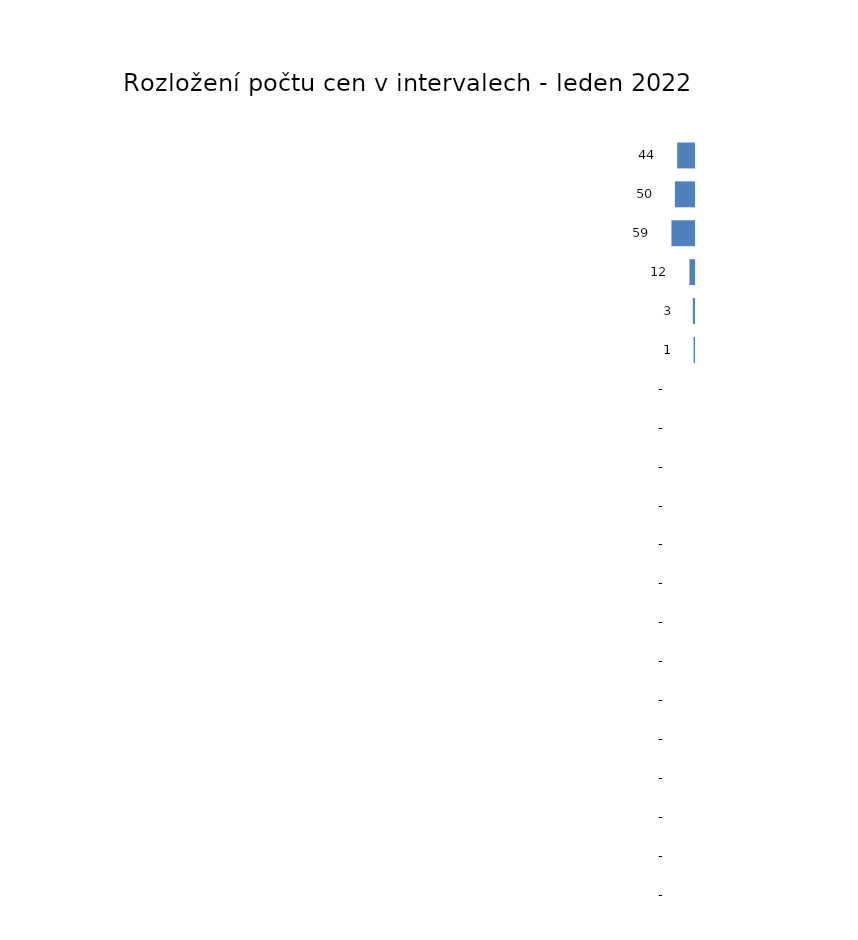
| Category | Rozložení počtu cen v intervalech - leden |
|---|---|
| ( 0 - 250 > | 44 |
| ( 250 - 500 > | 50 |
| ( 500 - 750 > | 59 |
| ( 750 - 1000 > | 12 |
| ( 1000 - 1250 > | 3 |
| ( 1250 - 1500 > | 1 |
| ( 1500 - 1750 > | 0 |
| ( 1750 - 2000 > | 0 |
| ( 2000 - 2250 > | 0 |
| ( 2250 - 2500 > | 0 |
| ( 2500 - 2750 > | 0 |
| ( 2750 - 3000 > | 0 |
| ( 3000 - 3250 > | 0 |
| ( 3250 - 3500 > | 0 |
| ( 3500 - 3750 > | 0 |
| ( 3750 - 4000 > | 0 |
| ( 4000 - 4250 > | 0 |
| ( 4250 - 4500 > | 0 |
| ( 4500 - 4750 > | 0 |
| ( 4750 - 5000 > | 0 |